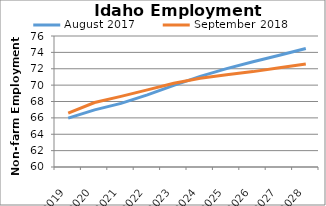
| Category | August 2017 | September 2018 |
|---|---|---|
| 2019.0 | 65.971 | 66.574 |
| 2020.0 | 66.983 | 67.872 |
| 2021.0 | 67.776 | 68.625 |
| 2022.0 | 68.808 | 69.423 |
| 2023.0 | 69.976 | 70.219 |
| 2024.0 | 71.062 | 70.84 |
| 2025.0 | 72.019 | 71.275 |
| 2026.0 | 72.847 | 71.65 |
| 2027.0 | 73.655 | 72.112 |
| 2028.0 | 74.469 | 72.571 |